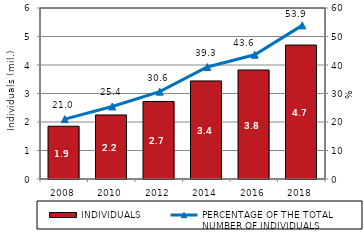
| Category | INDIVIDUALS |
|---|---|
| 2008.0 | 1.851 |
| 2010.0 | 2.247 |
| 2012.0 | 2.72 |
| 2014.0 | 3.441 |
| 2016.0 | 3.824 |
| 2018.0 | 4.7 |